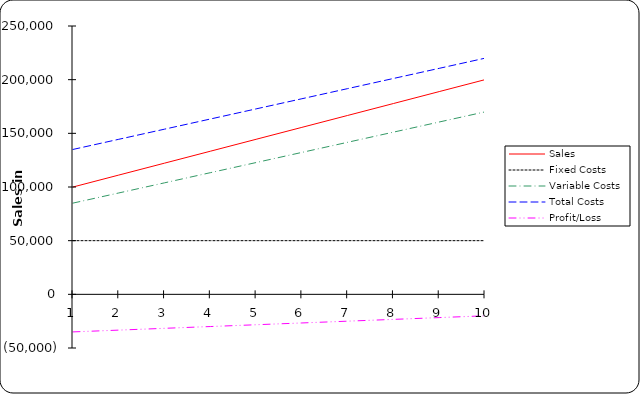
| Category | Sales | Fixed Costs | Variable Costs | Total Costs | Profit/Loss |
|---|---|---|---|---|---|
| 0 | 100000 | 50000 | 85000 | 135000 | -35000 |
| 1 | 111111.111 | 50000 | 94444.444 | 144444.444 | -33333.333 |
| 2 | 122222.222 | 50000 | 103888.889 | 153888.889 | -31666.667 |
| 3 | 133333.333 | 50000 | 113333.333 | 163333.333 | -30000 |
| 4 | 144444.444 | 50000 | 122777.778 | 172777.778 | -28333.333 |
| 5 | 155555.556 | 50000 | 132222.222 | 182222.222 | -26666.667 |
| 6 | 166666.667 | 50000 | 141666.667 | 191666.667 | -25000 |
| 7 | 177777.778 | 50000 | 151111.111 | 201111.111 | -23333.333 |
| 8 | 188888.889 | 50000 | 160555.556 | 210555.556 | -21666.667 |
| 9 | 200000 | 50000 | 170000 | 220000 | -20000 |